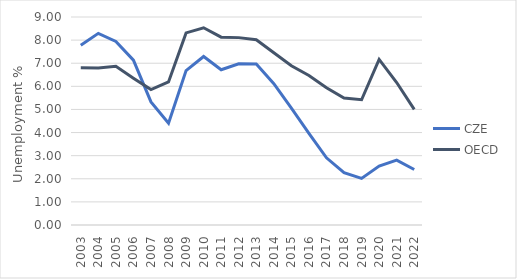
| Category | CZE | OECD |
|---|---|---|
| 2003.0 | 7.775 | 6.8 |
| 2004.0 | 8.292 | 6.797 |
| 2005.0 | 7.942 | 6.863 |
| 2006.0 | 7.133 | 6.353 |
| 2007.0 | 5.325 | 5.858 |
| 2008.0 | 4.408 | 6.188 |
| 2009.0 | 6.683 | 8.313 |
| 2010.0 | 7.292 | 8.535 |
| 2011.0 | 6.717 | 8.127 |
| 2012.0 | 6.975 | 8.108 |
| 2013.0 | 6.967 | 8.014 |
| 2014.0 | 6.117 | 7.455 |
| 2015.0 | 5.058 | 6.888 |
| 2016.0 | 3.967 | 6.47 |
| 2017.0 | 2.908 | 5.941 |
| 2018.0 | 2.267 | 5.491 |
| 2019.0 | 2.017 | 5.418 |
| 2020.0 | 2.55 | 7.164 |
| 2021.0 | 2.808 | 6.164 |
| 2022.0 | 2.4 | 5.003 |